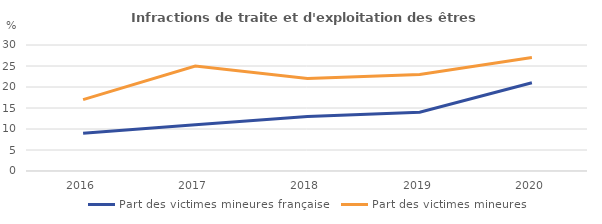
| Category | Part des victimes mineures française | Part des victimes mineures |
|---|---|---|
| 2016.0 | 9 | 17 |
| 2017.0 | 11 | 25 |
| 2018.0 | 13 | 22 |
| 2019.0 | 14 | 23 |
| 2020.0 | 21 | 27 |